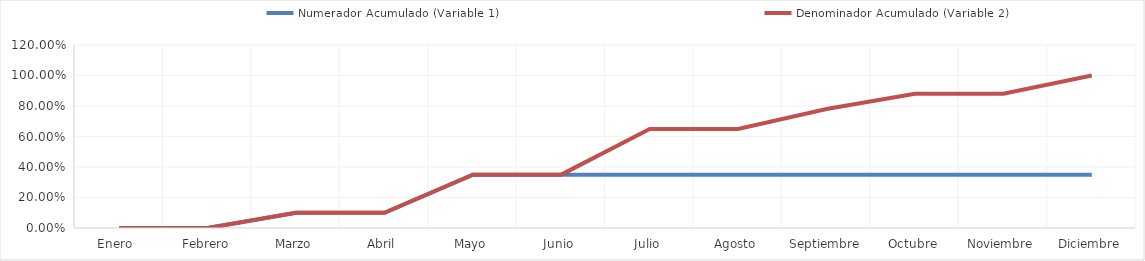
| Category | Numerador Acumulado (Variable 1) | Denominador Acumulado (Variable 2) |
|---|---|---|
| Enero  | 0 | 0 |
| Febrero | 0 | 0 |
| Marzo | 0.1 | 0.1 |
| Abril | 0.1 | 0.1 |
| Mayo | 0.35 | 0.35 |
| Junio | 0.35 | 0.35 |
| Julio | 0.35 | 0.65 |
| Agosto | 0.35 | 0.65 |
| Septiembre | 0.35 | 0.78 |
| Octubre | 0.35 | 0.88 |
| Noviembre | 0.35 | 0.88 |
| Diciembre | 0.35 | 1 |